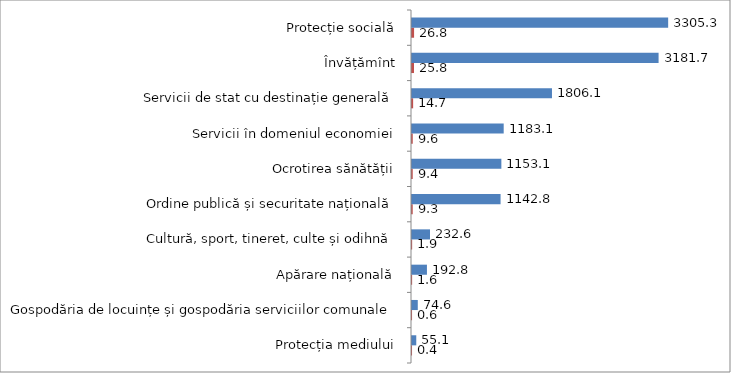
| Category | Series 1 | Series 0 |
|---|---|---|
| Protecția mediului | 0.447 | 55.1 |
| Gospodăria de locuințe și gospodăria serviciilor comunale | 0.605 | 74.6 |
| Apărare națională | 1.564 | 192.8 |
| Cultură, sport, tineret, culte și odihnă | 1.887 | 232.6 |
| Ordine publică și securitate națională | 9.271 | 1142.8 |
| Ocrotirea sănătății | 9.354 | 1153.1 |
| Servicii în domeniul economiei | 9.597 | 1183.1 |
| Servicii de stat cu destinație generală | 14.651 | 1806.1 |
| Învățămînt | 25.81 | 3181.7 |
| Protecție socială | 26.813 | 3305.3 |